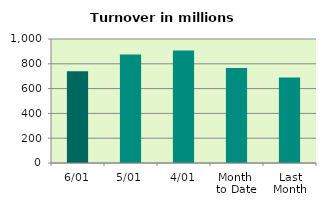
| Category | Series 0 |
|---|---|
| 6/01 | 739.408 |
| 5/01 | 874.862 |
| 4/01 | 906.983 |
| Month 
to Date | 765.281 |
| Last
Month | 689.27 |